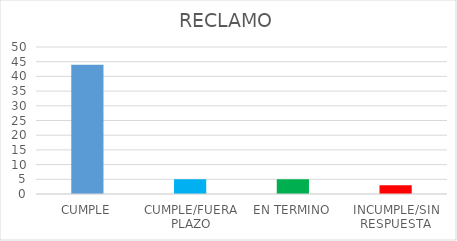
| Category | TOTAL |
|---|---|
| CUMPLE | 44 |
| CUMPLE/FUERA PLAZO | 5 |
| EN TERMINO | 5 |
| INCUMPLE/SIN RESPUESTA | 3 |